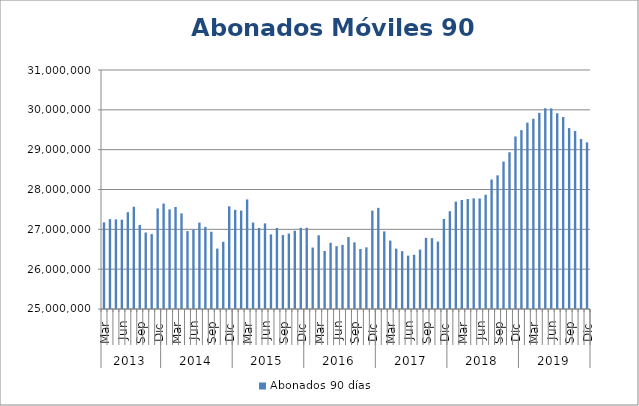
| Category | Abonados 90 días  |
|---|---|
| 0 | 27174429 |
| 1 | 27256799 |
| 2 | 27249896 |
| 3 | 27242396 |
| 4 | 27430194 |
| 5 | 27567464 |
| 6 | 27110010 |
| 7 | 26919316 |
| 8 | 26880609 |
| 9 | 27524963 |
| 10 | 27646717 |
| 11 | 27499992 |
| 12 | 27562088 |
| 13 | 27401040 |
| 14 | 26955717 |
| 15 | 26994609 |
| 16 | 27169188 |
| 17 | 27061687 |
| 18 | 26939071 |
| 19 | 26516500 |
| 20 | 26687326 |
| 21 | 27578143 |
| 22 | 27489223 |
| 23 | 27471553 |
| 24 | 27750473 |
| 25 | 27170692 |
| 26 | 27033211 |
| 27 | 27149172 |
| 28 | 26872979 |
| 29 | 27034173 |
| 30 | 26856662 |
| 31 | 26893632 |
| 32 | 26963755 |
| 33 | 27037951 |
| 34 | 27040824 |
| 35 | 26542149 |
| 36 | 26849710 |
| 37 | 26457447 |
| 38 | 26662676 |
| 39 | 26576782 |
| 40 | 26610099 |
| 41 | 26805521 |
| 42 | 26672717 |
| 43 | 26505805 |
| 44 | 26547173 |
| 45 | 27469211 |
| 46 | 27539556 |
| 47 | 26948853 |
| 48 | 26717067 |
| 49 | 26514588 |
| 50 | 26452370 |
| 51 | 26339907 |
| 52 | 26362130 |
| 53 | 26490787 |
| 54 | 26786764 |
| 55 | 26778405 |
| 56 | 26691976 |
| 57 | 27260107 |
| 58 | 27454349 |
| 59 | 27694179 |
| 60 | 27737550 |
| 61 | 27760296 |
| 62 | 27777818 |
| 63 | 27773600 |
| 64 | 27868225 |
| 65 | 28250702 |
| 66 | 28355724 |
| 67 | 28700770 |
| 68 | 28935345 |
| 69 | 29331337 |
| 70 | 29491024 |
| 71 | 29679237 |
| 72 | 29775295 |
| 73 | 29924167 |
| 74 | 30039747 |
| 75 | 30035533 |
| 76 | 29914508 |
| 77 | 29819526 |
| 78 | 29541515 |
| 79 | 29467889 |
| 80 | 29266254 |
| 81 | 29183632 |